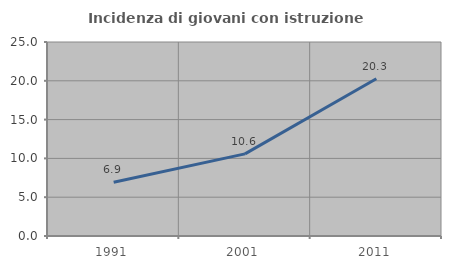
| Category | Incidenza di giovani con istruzione universitaria |
|---|---|
| 1991.0 | 6.922 |
| 2001.0 | 10.58 |
| 2011.0 | 20.257 |